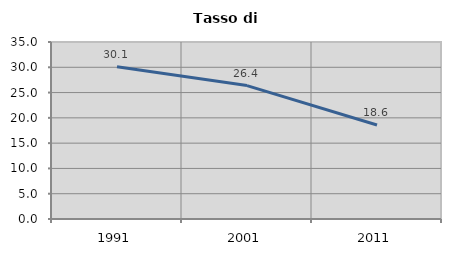
| Category | Tasso di disoccupazione   |
|---|---|
| 1991.0 | 30.108 |
| 2001.0 | 26.377 |
| 2011.0 | 18.594 |